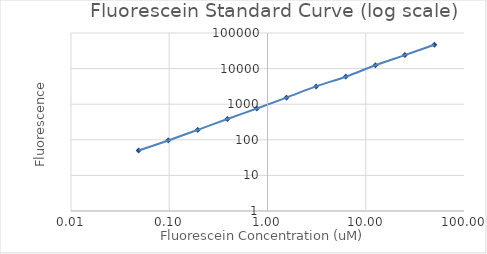
| Category | Series2 |
|---|---|
| 50.0 | 46597.5 |
| 25.0 | 23965.5 |
| 12.5 | 12403.25 |
| 6.25 | 5927.25 |
| 3.125 | 3161 |
| 1.5625 | 1531 |
| 0.78125 | 756.5 |
| 0.390625 | 384 |
| 0.195312 | 190.5 |
| 0.097656 | 95.75 |
| 0.048828 | 50 |